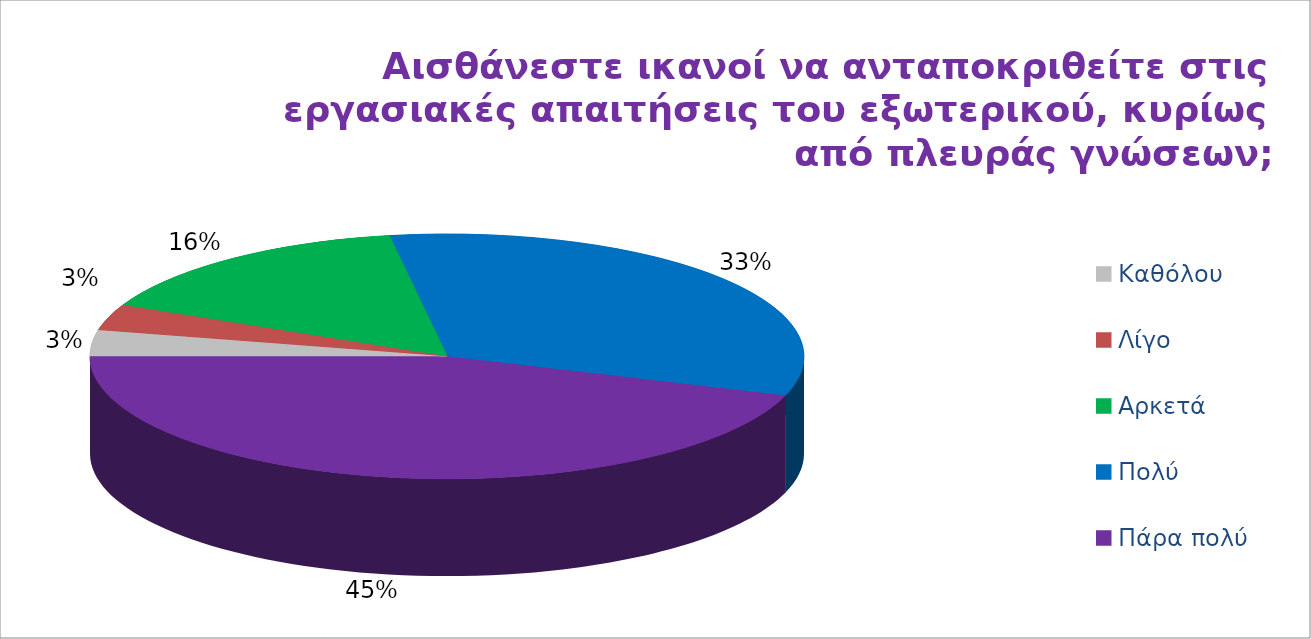
| Category | Series 2 | Series 1 | Series 0 |
|---|---|---|---|
| Καθόλου | 2 | 6 | 2 |
| Λίγο | 2 | 13 | 7 |
| Αρκετά | 9 | 12 | 30 |
| Πολύ | 19 | 14 | 9 |
| Πάρα πολύ | 26 | 13 | 10 |